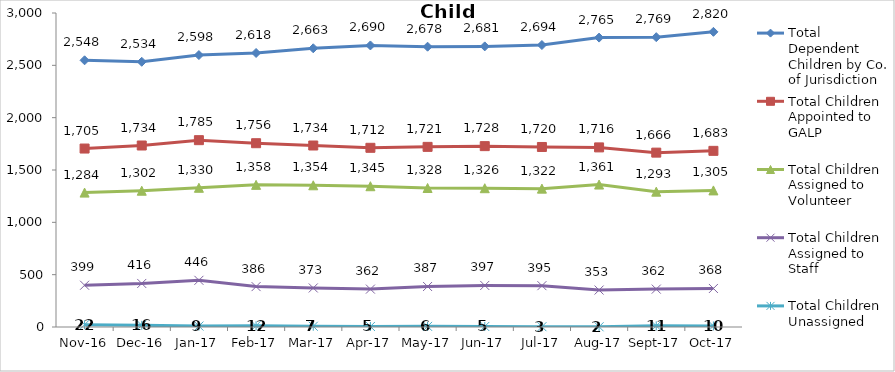
| Category | Total Dependent Children by Co. of Jurisdiction | Total Children Appointed to GALP | Total Children Assigned to Volunteer | Total Children Assigned to Staff | Total Children Unassigned |
|---|---|---|---|---|---|
| 2016-11-01 | 2548 | 1705 | 1284 | 399 | 22 |
| 2016-12-01 | 2534 | 1734 | 1302 | 416 | 16 |
| 2017-01-01 | 2598 | 1785 | 1330 | 446 | 9 |
| 2017-02-01 | 2618 | 1756 | 1358 | 386 | 12 |
| 2017-03-01 | 2663 | 1734 | 1354 | 373 | 7 |
| 2017-04-01 | 2690 | 1712 | 1345 | 362 | 5 |
| 2017-05-01 | 2678 | 1721 | 1328 | 387 | 6 |
| 2017-06-01 | 2681 | 1728 | 1326 | 397 | 5 |
| 2017-07-01 | 2694 | 1720 | 1322 | 395 | 3 |
| 2017-08-01 | 2765 | 1716 | 1361 | 353 | 2 |
| 2017-09-01 | 2769 | 1666 | 1293 | 362 | 11 |
| 2017-10-01 | 2820 | 1683 | 1305 | 368 | 10 |